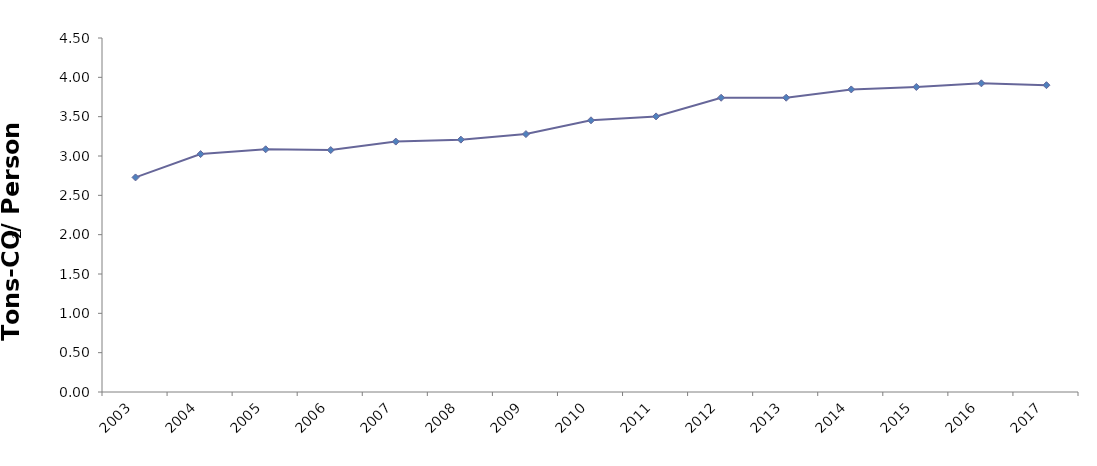
| Category | CO2/POP
(Ton-CO2/Person) |
|---|---|
| 2003 | 2.728 |
| 2004 | 3.024 |
| 2005 | 3.085 |
| 2006 | 3.076 |
| 2007 | 3.183 |
| 2008 | 3.208 |
| 2009 | 3.279 |
| 2010 | 3.454 |
| 2011 | 3.503 |
| 2012 | 3.74 |
| 2013 | 3.741 |
| 2014 | 3.846 |
| 2015 | 3.877 |
| 2016 | 3.924 |
| 2017 | 3.9 |